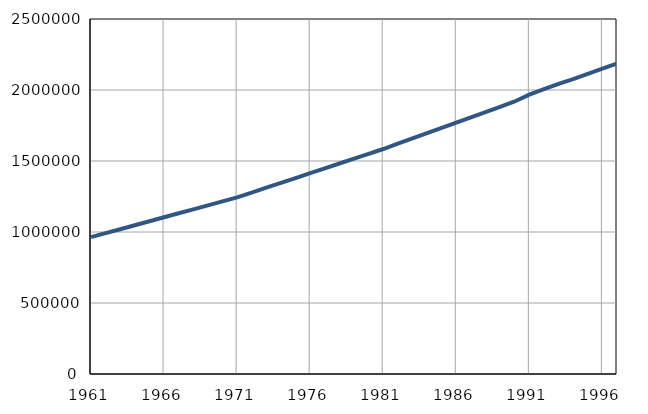
| Category | Population
size |
|---|---|
| 1961.0 | 963715 |
| 1962.0 | 991725 |
| 1963.0 | 1019735 |
| 1964.0 | 1047745 |
| 1965.0 | 1075755 |
| 1966.0 | 1103765 |
| 1967.0 | 1131775 |
| 1968.0 | 1159785 |
| 1969.0 | 1187795 |
| 1970.0 | 1215805 |
| 1971.0 | 1243811 |
| 1972.0 | 1277879 |
| 1973.0 | 1311947 |
| 1974.0 | 1346015 |
| 1975.0 | 1380083 |
| 1976.0 | 1414151 |
| 1977.0 | 1448219 |
| 1978.0 | 1482287 |
| 1979.0 | 1516355 |
| 1980.0 | 1550423 |
| 1981.0 | 1584440 |
| 1982.0 | 1621616 |
| 1983.0 | 1658792 |
| 1984.0 | 1695968 |
| 1985.0 | 1733144 |
| 1986.0 | 1770320 |
| 1987.0 | 1807496 |
| 1988.0 | 1844672 |
| 1989.0 | 1881848 |
| 1990.0 | 1919024 |
| 1991.0 | 1967000 |
| 1992.0 | 2006000 |
| 1993.0 | 2043000 |
| 1994.0 | 2077000 |
| 1995.0 | 2113000 |
| 1996.0 | 2151000 |
| 1997.0 | 2186000 |